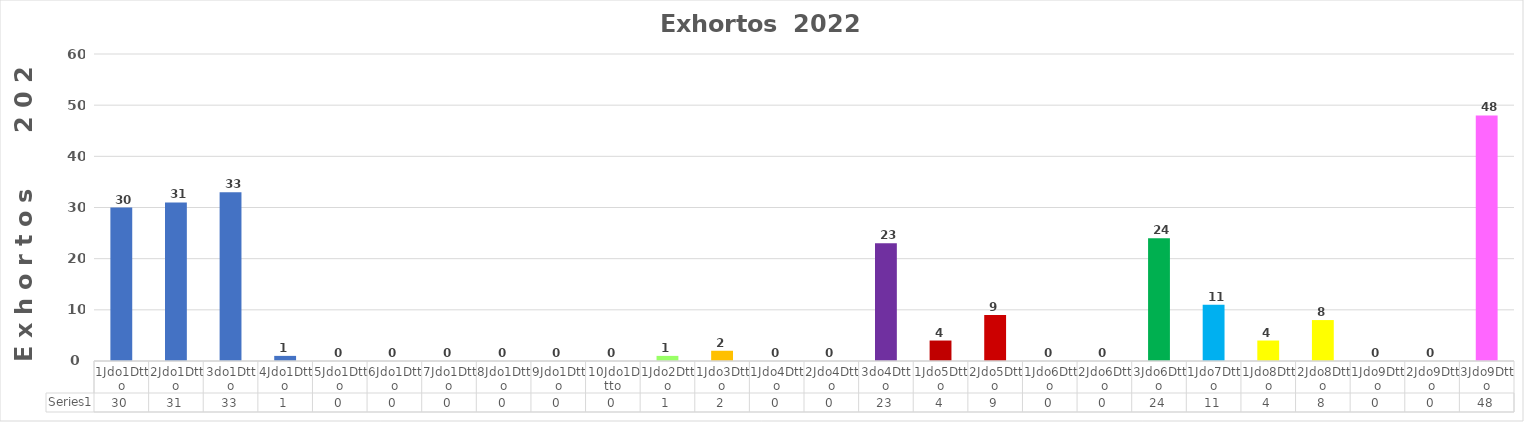
| Category | Series 0 |
|---|---|
| 1Jdo1Dtto | 30 |
| 2Jdo1Dtto | 31 |
| 3do1Dtto | 33 |
| 4Jdo1Dtto | 1 |
| 5Jdo1Dtto | 0 |
| 6Jdo1Dtto | 0 |
| 7Jdo1Dtto | 0 |
| 8Jdo1Dtto | 0 |
| 9Jdo1Dtto | 0 |
| 10Jdo1Dtto | 0 |
| 1Jdo2Dtto | 1 |
| 1Jdo3Dtto | 2 |
| 1Jdo4Dtto | 0 |
| 2Jdo4Dtto | 0 |
| 3do4Dtto | 23 |
| 1Jdo5Dtto | 4 |
| 2Jdo5Dtto | 9 |
| 1Jdo6Dtto | 0 |
| 2Jdo6Dtto | 0 |
| 3Jdo6Dtto | 24 |
| 1Jdo7Dtto | 11 |
| 1Jdo8Dtto | 4 |
| 2Jdo8Dtto | 8 |
| 1Jdo9Dtto | 0 |
| 2Jdo9Dtto | 0 |
| 3Jdo9Dtto | 48 |